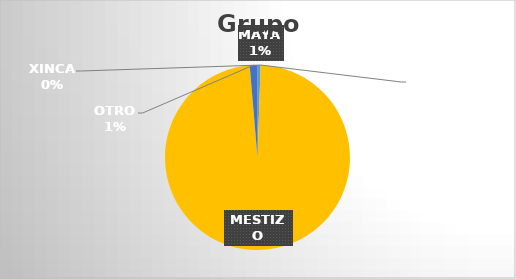
| Category | Series 0 |
|---|---|
| MAYA | 2 |
| GARIFUNA | 0 |
| XINCA | 0 |
| MESTIZO | 363 |
| OTRO | 5 |